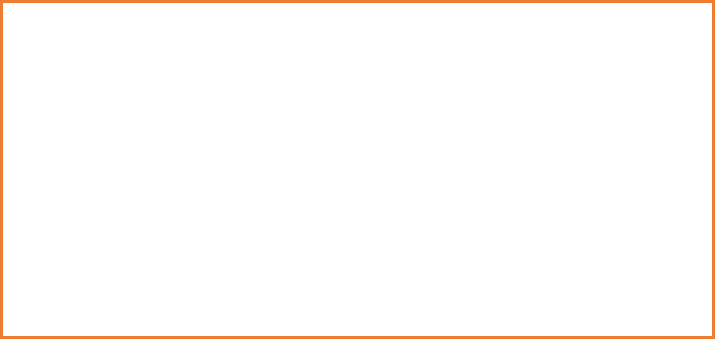
| Category | Total |
|---|---|
| Feb | 2 |
| Mar | 7 |
| Abr | 25 |
| May | 38 |
| Jun | 2 |
| Jul | 3 |
| Nov | 1 |